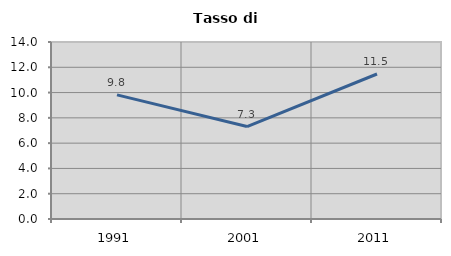
| Category | Tasso di disoccupazione   |
|---|---|
| 1991.0 | 9.817 |
| 2001.0 | 7.313 |
| 2011.0 | 11.468 |